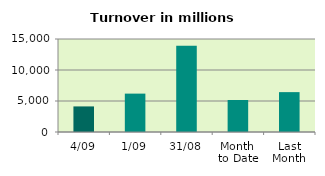
| Category | Series 0 |
|---|---|
| 4/09 | 4126.041 |
| 1/09 | 6190.763 |
| 31/08 | 13896.487 |
| Month 
to Date | 5158.402 |
| Last
Month | 6430.895 |